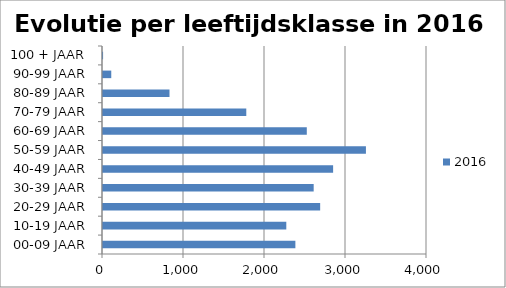
| Category | 2016 |
|---|---|
| 00-09 JAAR | 2375 |
| 10-19 JAAR | 2263 |
| 20-29 JAAR | 2681 |
| 30-39 JAAR | 2601 |
| 40-49 JAAR | 2841 |
| 50-59 JAAR | 3246 |
| 60-69 JAAR | 2516 |
| 70-79 JAAR | 1769 |
| 80-89 JAAR | 821 |
| 90-99 JAAR | 102 |
| 100 + JAAR | 1 |